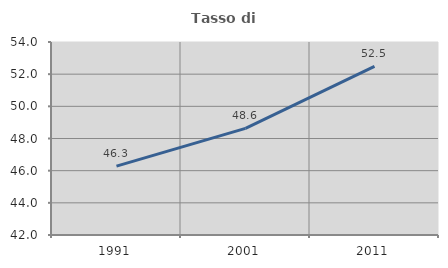
| Category | Tasso di occupazione   |
|---|---|
| 1991.0 | 46.28 |
| 2001.0 | 48.63 |
| 2011.0 | 52.479 |